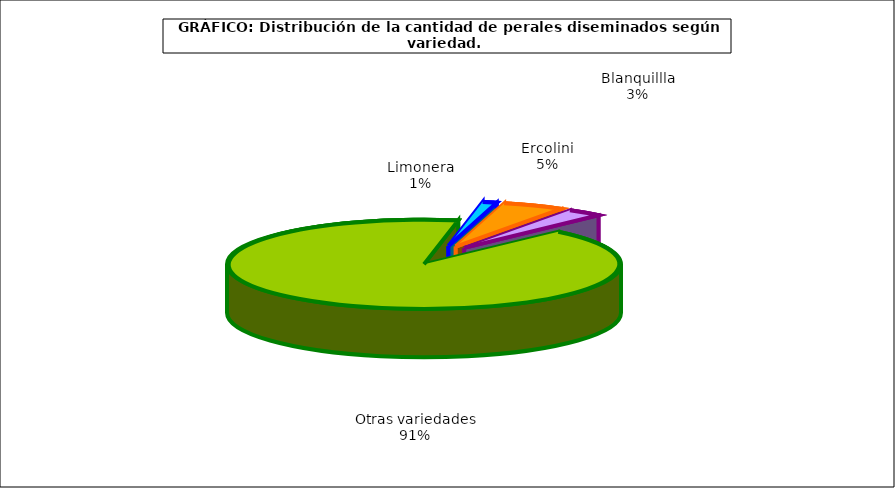
| Category | arboles |
|---|---|
| 0 | 5.87 |
| 1 | 25.407 |
| 2 | 14.662 |
| 3 | 455.852 |